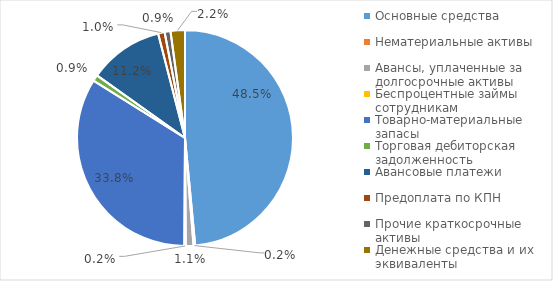
| Category | Series 0 |
|---|---|
| Основные средства | 0.485 |
| Нематериальные активы | 0.002 |
| Авансы, уплаченные за долгосрочные активы | 0.011 |
| Беспроцентные займы сотрудникам | 0.002 |
| Товарно-материальные запасы | 0.338 |
| Торговая дебиторская задолженность | 0.009 |
| Авансовые платежи | 0.112 |
| Предоплата по КПН | 0.01 |
| Прочие краткосрочные активы | 0.009 |
| Денежные средства и их эквиваленты | 0.022 |